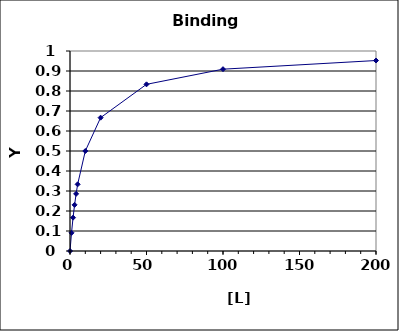
| Category | Series 0 |
|---|---|
| 0.0 | 0 |
| 1.0 | 0.091 |
| 2.0 | 0.167 |
| 3.0 | 0.231 |
| 4.0 | 0.286 |
| 5.0 | 0.333 |
| 10.0 | 0.5 |
| 20.0 | 0.667 |
| 50.0 | 0.833 |
| 100.0 | 0.909 |
| 200.0 | 0.952 |